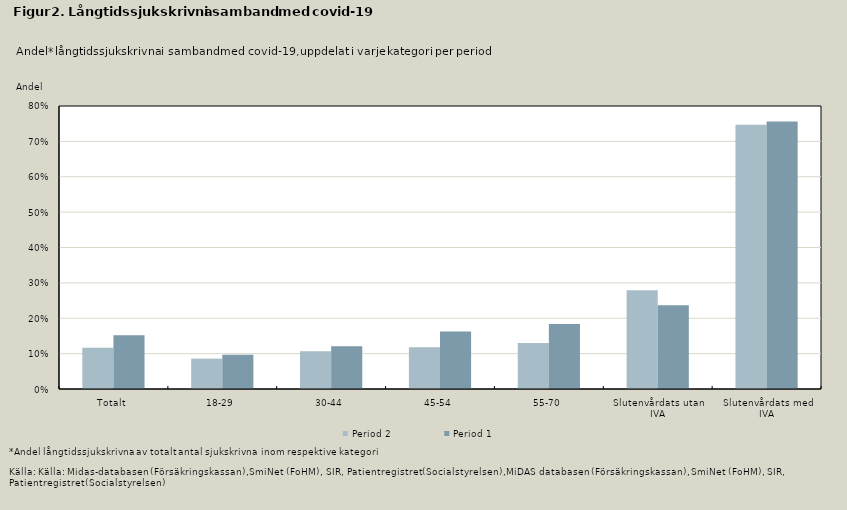
| Category | Period 2 | Period 1 |
|---|---|---|
| Totalt | 0.116 | 0.152 |
| 18-29 | 0.086 | 0.097 |
| 30-44 | 0.107 | 0.121 |
| 45-54 | 0.118 | 0.163 |
| 55-70 | 0.13 | 0.184 |
| Slutenvårdats utan IVA | 0.279 | 0.237 |
| Slutenvårdats med IVA | 0.747 | 0.756 |